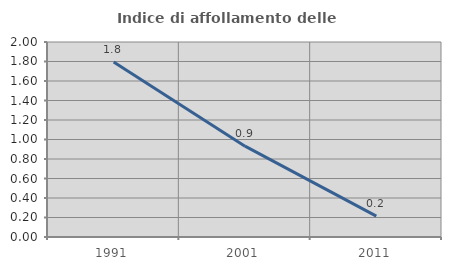
| Category | Indice di affollamento delle abitazioni  |
|---|---|
| 1991.0 | 1.796 |
| 2001.0 | 0.932 |
| 2011.0 | 0.214 |